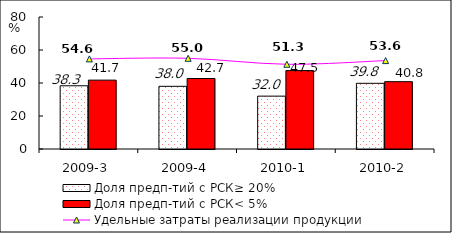
| Category | Доля предп-тий с РСК≥ 20% | Доля предп-тий с РСК< 5% |
|---|---|---|
| 2009-3 | 38.32 | 41.74 |
| 2009-4 | 37.99 | 42.72 |
| 2010-1 | 32.04 | 47.51 |
| 2010-2 | 39.82 | 40.8 |